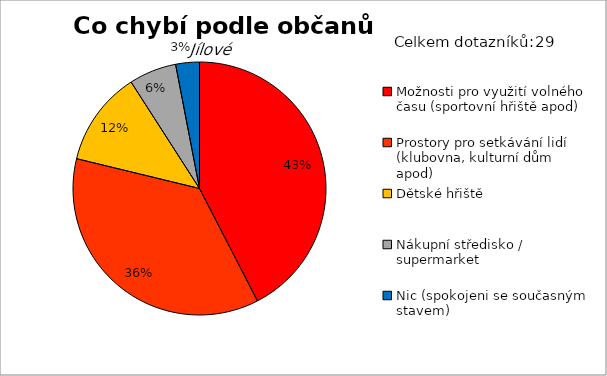
| Category | Series 0 |
|---|---|
| Možnosti pro využití volného času (sportovní hřiště apod) | 14 |
| Prostory pro setkávání lidí (klubovna, kulturní dům apod) | 12 |
| Dětské hřiště | 4 |
| Nákupní středisko / supermarket | 2 |
| Nic (spokojeni se současným stavem) | 1 |